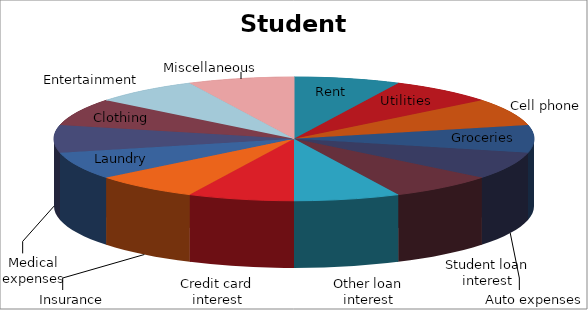
| Category | Amount |
|---|---|
| Rent | 5 |
| Utilities | 5 |
| Cell phone | 5 |
| Groceries | 5 |
| Auto expenses | 5 |
| Student loan interest | 5 |
| Other loan interest | 5 |
| Credit card interest | 5 |
| Insurance | 5 |
| Laundry | 5 |
| Medical expenses | 5 |
| Clothing | 5 |
| Entertainment | 5 |
| Miscellaneous | 5 |